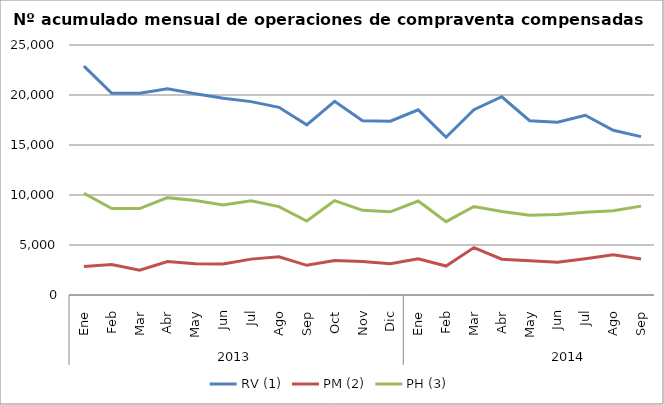
| Category | RV (1) | PM (2) | PH (3) |
|---|---|---|---|
| 0 | 22894 | 2853 | 10176 |
| 1 | 20174 | 3047 | 8641 |
| 2 | 20169 | 2472 | 8638 |
| 3 | 20616 | 3350 | 9736 |
| 4 | 20126 | 3117 | 9441 |
| 5 | 19686 | 3099 | 9000 |
| 6 | 19337 | 3588 | 9415 |
| 7 | 18769 | 3829 | 8838 |
| 8 | 17015 | 2969 | 7402 |
| 9 | 19371 | 3453 | 9435 |
| 10 | 17427 | 3359 | 8465 |
| 11 | 17377 | 3135 | 8315 |
| 12 | 18515 | 3629 | 9396 |
| 13 | 15776 | 2899 | 7337 |
| 14 | 18527 | 4739 | 8846 |
| 15 | 19824 | 3575 | 8345 |
| 16 | 17431 | 3429 | 7965 |
| 17 | 17272 | 3273 | 8041 |
| 18 | 17970 | 3623 | 8279 |
| 19 | 16473 | 4014 | 8423 |
| 20 | 15837 | 3610 | 8889 |